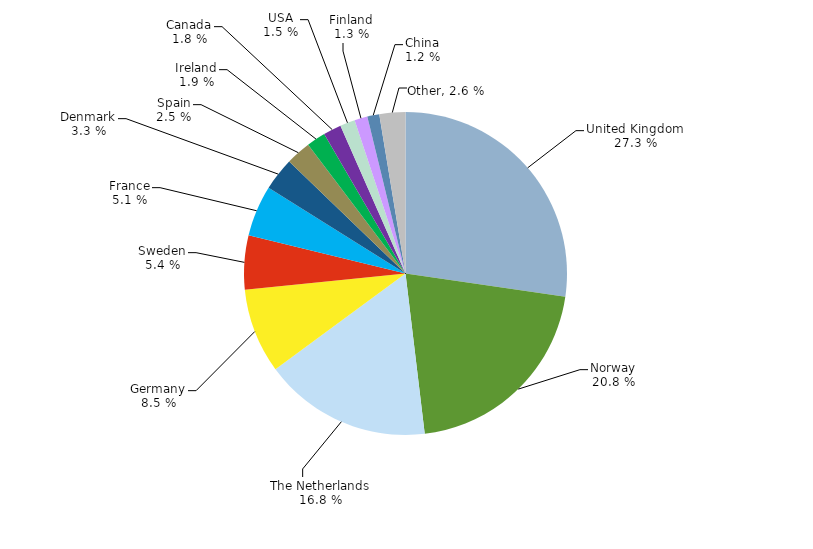
| Category | Series 0 |
|---|---|
| United Kingdom | 0.273 |
| Norway | 0.208 |
| The Netherlands | 0.168 |
| Germany | 0.085 |
| Sweden | 0.054 |
| France | 0.051 |
| Denmark | 0.033 |
| Spain | 0.025 |
| Ireland | 0.019 |
| Canada | 0.018 |
| USA | 0.015 |
| Finland | 0.013 |
| China | 0.012 |
| Other | 0.026 |